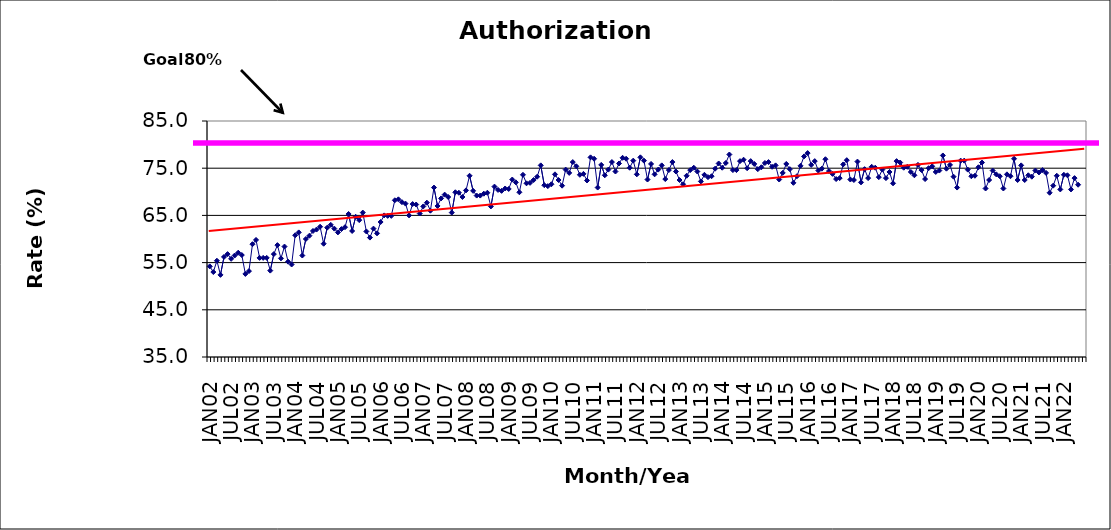
| Category | Series 0 |
|---|---|
| JAN02 | 54.2 |
| FEB02 | 53 |
| MAR02 | 55.4 |
| APR02 | 52.4 |
| MAY02 | 56.2 |
| JUN02 | 56.8 |
| JUL02 | 55.8 |
| AUG02 | 56.5 |
| SEP02 | 57.1 |
| OCT02 | 56.6 |
| NOV02 | 52.6 |
| DEC02 | 53.2 |
| JAN03 | 58.9 |
| FEB03 | 59.8 |
| MAR03 | 56 |
| APR03 | 56 |
| MAY03 | 56 |
| JUN03 | 53.3 |
| JUL03 | 56.8 |
| AUG03 | 58.7 |
| SEP03 | 55.9 |
| OCT03 | 58.4 |
| NOV03 | 55.2 |
| DEC03 | 54.6 |
| JAN04 | 60.8 |
| FEB04 | 61.4 |
| MAR04 | 56.5 |
| APR04 | 60 |
| MAY04 | 60.7 |
| JUN04 | 61.7 |
| JUL04 | 62 |
| AUG04 | 62.6 |
| SEP04 | 59 |
| OCT04 | 62.4 |
| NOV04 | 63 |
| DEC04 | 62.2 |
| JAN05 | 61.4 |
| FEB05 | 62.1 |
| MAR05 | 62.5 |
| APR05 | 65.3 |
| MAY05 | 61.7 |
| JUN05 | 64.7 |
| JUL05 | 64 |
| AUG05 | 65.6 |
| SEP05 | 61.6 |
| OCT05 | 60.3 |
| NOV05 | 62.2 |
| DEC05 | 61.2 |
| JAN06 | 63.6 |
| FEB06 | 65 |
| MAR06 | 64.9 |
| APR06 | 64.9 |
| MAY06 | 68.2 |
| JUN06 | 68.4 |
| JUL06 | 67.8 |
| AUG06 | 67.5 |
| SEP06 | 65 |
| OCT06 | 67.4 |
| NOV06 | 67.3 |
| DEC06 | 65.4 |
| JAN07 | 66.9 |
| FEB07 | 67.7 |
| MAR07 | 66 |
| APR07 | 70.9 |
| MAY07 | 67 |
| JUN07 | 68.6 |
| JUL07 | 69.4 |
| AUG07 | 68.9 |
| SEP07 | 65.6 |
| OCT07 | 69.9 |
| NOV07 | 69.8 |
| DEC07 | 68.9 |
| JAN08 | 70.3 |
| FEB08 | 73.4 |
| MAR08 | 70.2 |
| APR08 | 69.2 |
| MAY08 | 69.2 |
| JUN08 | 69.6 |
| JUL08 | 69.8 |
| AUG08 | 66.9 |
| SEP08 | 71.1 |
| OCT08 | 70.4 |
| NOV08 | 70.2 |
| DEC08 | 70.7 |
| JAN09 | 70.6 |
| FEB09 | 72.6 |
| MAR09 | 72 |
| APR09 | 69.9 |
| MAY09 | 73.6 |
| JUN09 | 71.8 |
| JUL09 | 71.9 |
| AUG09 | 72.5 |
| SEP09 | 73.2 |
| OCT09 | 75.6 |
| NOV09 | 71.4 |
| DEC09 | 71.2 |
| JAN10 | 71.6 |
| FEB10 | 73.7 |
| MAR10 | 72.5 |
| APR10 | 71.3 |
| MAY10 | 74.7 |
| JUN10 | 74 |
| JUL10 | 76.3 |
| AUG10 | 75.4 |
| SEP10 | 73.6 |
| OCT10 | 73.8 |
| NOV10 | 72.4 |
| DEC10 | 77.3 |
| JAN11 | 77 |
| FEB11 | 70.9 |
| MAR11 | 75.7 |
| APR11 | 73.5 |
| MAY11 | 74.7 |
| JUN11 | 76.3 |
| JUL11 | 74.3 |
| AUG11 | 76 |
| SEP11 | 77.2 |
| OCT11 | 77 |
| NOV11 | 75.1 |
| DEC11 | 76.6 |
| JAN12 | 73.7 |
| FEB12 | 77.3 |
| MAR12 | 76.6 |
| APR12 | 72.6 |
| MAY12 | 75.9 |
| JUN12 | 73.7 |
| JUL12 | 74.7 |
| AUG12 | 75.6 |
| SEP12 | 72.7 |
| OCT12 | 74.6 |
| NOV12 | 76.3 |
| DEC12 | 74.3 |
| JAN13 | 72.5 |
| FEB13 | 71.6 |
| MAR13 | 73.4 |
| APR13 | 74.6 |
| MAY13 | 75.1 |
| JUN13 | 74.3 |
| JUL13 | 72.2 |
| AUG13 | 73.6 |
| SEP13 | 73.1 |
| OCT13 | 73.3 |
| NOV13 | 74.9 |
| DEC13 | 76 |
| JAN14 | 75.1 |
| FEB14 | 76.1 |
| MAR14 | 77.9 |
| APR14 | 74.6 |
| MAY14 | 74.6 |
| JUN14 | 76.5 |
| JUL14 | 76.8 |
| AUG14 | 75 |
| SEP14 | 76.5 |
| OCT14 | 75.9 |
| NOV14 | 74.8 |
| DEC14 | 75.2 |
| JAN15 | 76.1 |
| FEB15 | 76.3 |
| MAR15 | 75.3 |
| APR15 | 75.6 |
| MAY15 | 72.6 |
| JUN15 | 74 |
| JUL15 | 75.9 |
| AUG15 | 74.8 |
| SEP15 | 71.9 |
| OCT15 | 73.3 |
| NOV15 | 75.5 |
| DEC15 | 77.5 |
| JAN16 | 78.2 |
| FEB16 | 75.7 |
| MAR16 | 76.5 |
| APR16 | 74.5 |
| MAY16 | 74.9 |
| JUN16 | 76.9 |
| JUL16 | 74.4 |
| AUG16 | 73.8 |
| SEP16 | 72.7 |
| OCT16 | 72.9 |
| NOV16 | 75.8 |
| DEC16 | 76.7 |
| JAN17 | 72.6 |
| FEB17 | 72.5 |
| MAR17 | 76.4 |
| APR17 | 72 |
| MAY17 | 74.8 |
| JUN17 | 72.9 |
| JUL17 | 75.3 |
| AUG17 | 75.1 |
| SEP17 | 73.1 |
| OCT17 | 74.7 |
| NOV17 | 72.9 |
| DEC17 | 74.2 |
| JAN18 | 71.8 |
| FEB18 | 76.5 |
| MAR18 | 76.2 |
| APR18 | 75.1 |
| MAY18 | 75.3 |
| JUN18 | 74.2 |
| JUL18 | 73.5 |
| AUG18 | 75.7 |
| SEP18 | 74.6 |
| OCT18 | 72.7 |
| NOV18 | 75 |
| DEC18 | 75.4 |
| JAN19 | 74.2 |
| FEB19 | 74.5 |
| MAR19 | 77.7 |
| APR19 | 74.9 |
| MAY19 | 75.7 |
| JUN19 | 73.2 |
| JUL19 | 70.9 |
| AUG19 | 76.6 |
| SEP19 | 76.6 |
| OCT19 | 74.7 |
| NOV19 | 73.3 |
| DEC19 | 73.4 |
| JAN20 | 75.2 |
| FEB20 | 76.2 |
| MAR20 | 70.7 |
| APR20 | 72.5 |
| MAY20 | 74.5 |
| JUN20 | 73.7 |
| JUL20 | 73.3 |
| AUG20 | 70.7 |
| SEP20 | 73.7 |
| OCT20 | 73.3 |
| NOV20 | 77 |
| DEC20 | 72.5 |
| JAN21 | 75.6 |
| FEB21 | 72.5 |
| MAR21 | 73.5 |
| APR21 | 73.2 |
| MAY21 | 74.5 |
| JUN21 | 74.1 |
| JUL21 | 74.6 |
| AUG21 | 74 |
| SEP21 | 69.8 |
| OCT21 | 71.3 |
| NOV21 | 73.4 |
| DEC21 | 70.5 |
| JAN22 | 73.6 |
| FEB22 | 73.5 |
| MAR22 | 70.5 |
| APR22 | 72.9 |
| MAY22 | 71.5 |